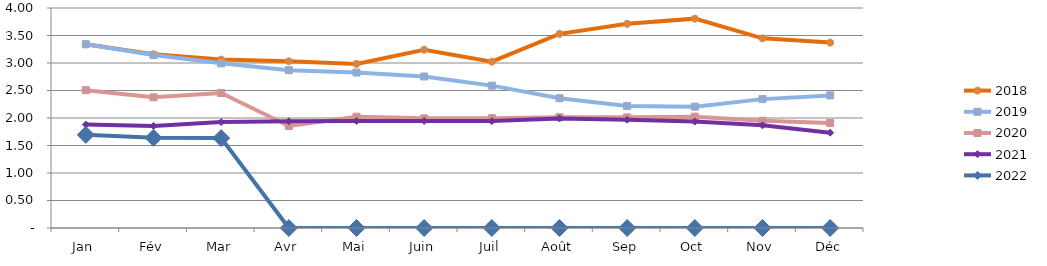
| Category | 2018 | 2019 | 2020 | 2021 | 2022 |
|---|---|---|---|---|---|
| Jan | 3.34 | 3.341 | 2.506 | 1.881 | 1.693 |
| Fév | 3.159 | 3.145 | 2.376 | 1.856 | 1.64 |
| Mar | 3.062 | 2.994 | 2.455 | 1.926 | 1.635 |
| Avr | 3.031 | 2.87 | 1.855 | 1.939 | 0 |
| Mai | 2.984 | 2.827 | 2.023 | 1.946 | 0 |
| Juin | 3.242 | 2.755 | 1.993 | 1.947 | 0 |
| Juil | 3.025 | 2.589 | 1.998 | 1.943 | 0 |
| Août | 3.53 | 2.359 | 2.015 | 1.992 | 0 |
| Sep | 3.712 | 2.22 | 2.012 | 1.968 | 0 |
| Oct | 3.806 | 2.206 | 2.024 | 1.935 | 0 |
| Nov | 3.449 | 2.343 | 1.95 | 1.867 | 0 |
| Déc | 3.371 | 2.411 | 1.909 | 1.733 | 0 |